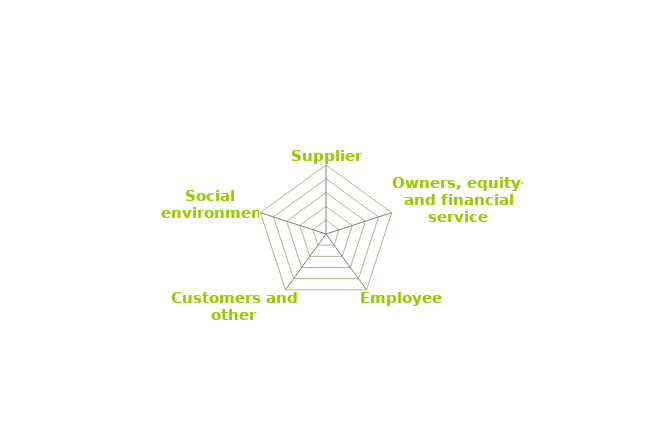
| Category | Series 0 |
|---|---|
| Suppliers | 0 |
| Owners, equity- and financial service providers | 0 |
| Employees | 0 |
| Customers and other companies | 0 |
| Social environment | 0 |